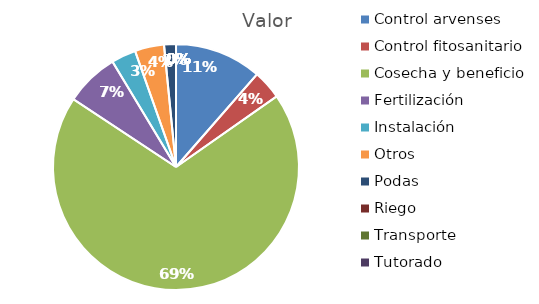
| Category | Valor |
|---|---|
| Control arvenses | 11094916 |
| Control fitosanitario | 3726336 |
| Cosecha y beneficio | 67018331 |
| Fertilización | 6870432 |
| Instalación | 3144096 |
| Otros | 3726336 |
| Podas | 1513824 |
| Riego | 0 |
| Transporte | 0 |
| Tutorado | 0 |